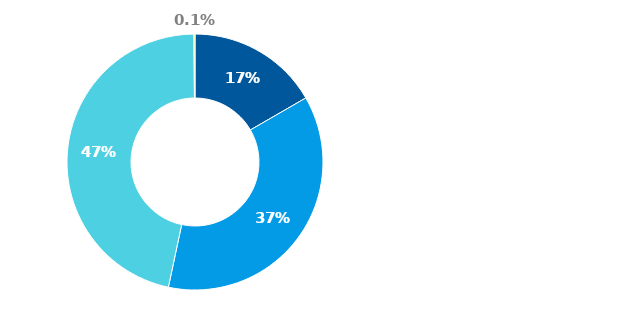
| Category | Series 0 |
|---|---|
| Hotovost | 0.167 |
| Půjčky poskytnuté nemovitostní společnosti | 0.367 |
| Majetkové účasti v nemovitostní společnosti | 0.465 |
| Ostatní finanční aktiva | 0.001 |